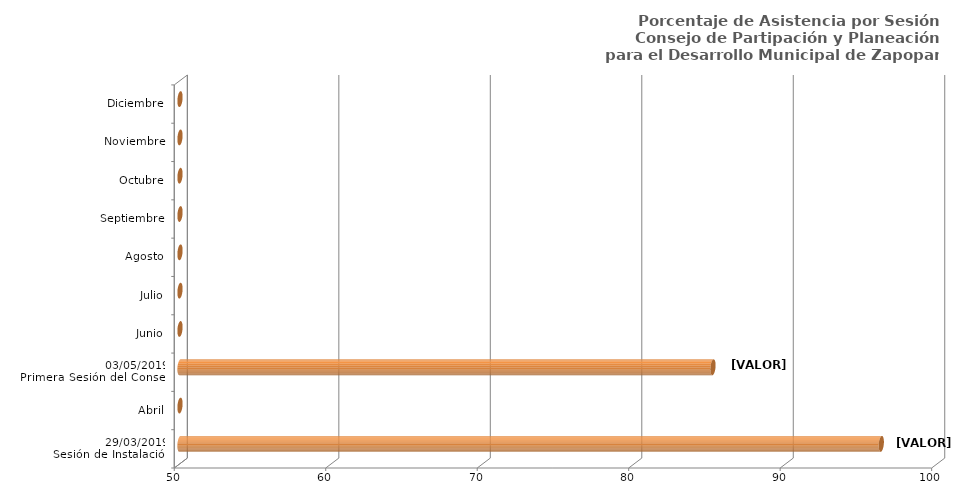
| Category | Series 0 |
|---|---|
| 29/03/2019
Sesión de Instalación | 96.296 |
| Abril | 0 |
| 03/05/2019
Primera Sesión del Consejo | 85.185 |
| Junio | 0 |
| Julio | 0 |
| Agosto | 0 |
| Septiembre | 0 |
| Octubre | 0 |
| Noviembre | 0 |
| Diciembre | 0 |